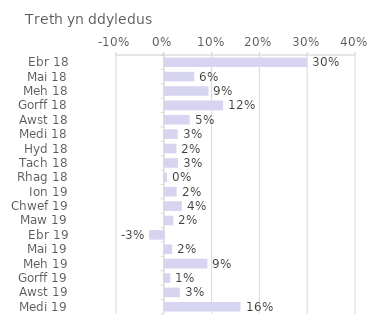
| Category | Treth yn ddyledus |
|---|---|
| Ebr 18 | 0.297 |
| Mai 18 | 0.062 |
| Meh 18 | 0.091 |
| Gorff 18 | 0.122 |
| Awst 18 | 0.052 |
| Medi 18 | 0.027 |
| Hyd 18 | 0.024 |
| Tach 18 | 0.027 |
| Rhag 18 | 0.005 |
| Ion 19 | 0.025 |
| Chwef 19 | 0.036 |
| Maw 19 | 0.018 |
| Ebr 19 | -0.031 |
| Mai 19 | 0.015 |
| Meh 19 | 0.089 |
| Gorff 19 | 0.011 |
| Awst 19 | 0.031 |
| Medi 19 | 0.158 |